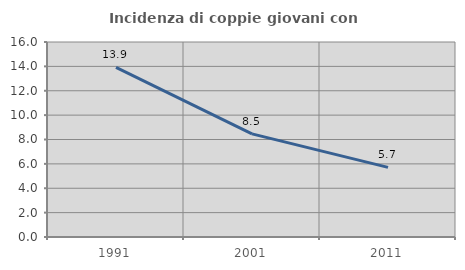
| Category | Incidenza di coppie giovani con figli |
|---|---|
| 1991.0 | 13.914 |
| 2001.0 | 8.461 |
| 2011.0 | 5.71 |